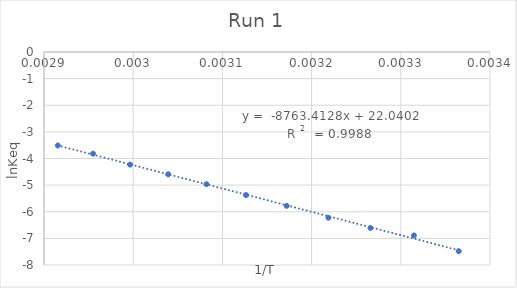
| Category | Series 0 |
|---|---|
| 0.003364963994885255 | -7.48 |
| 0.003314770617873243 | -6.89 |
| 0.0032660526487686982 | -6.609 |
| 0.0032188495831589788 | -6.223 |
| 0.003171985028230667 | -5.778 |
| 0.0031264655307175235 | -5.373 |
| 0.0030821390044691015 | -4.965 |
| 0.0030392365437802026 | -4.594 |
| 0.002996524032122737 | -4.229 |
| 0.002954995419757099 | -3.819 |
| 0.0029154518950437317 | -3.511 |